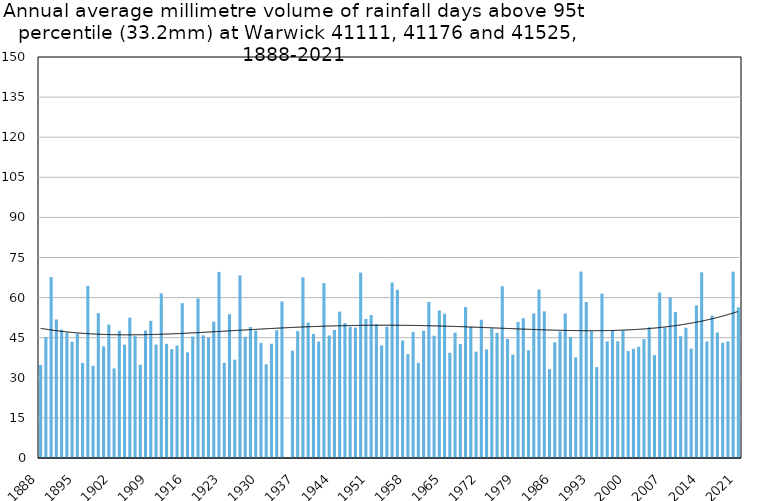
| Category | Annual average mm in days above 95th percentile |
|---|---|
| 1888 | 34.8 |
| 1889 | 45.267 |
| 1890 | 67.683 |
| 1891 | 51.82 |
| 1892 | 48 |
| 1893 | 46.878 |
| 1894 | 43.5 |
| 1895 | 46.5 |
| 1896 | 35.567 |
| 1897 | 64.4 |
| 1898 | 34.5 |
| 1899 | 54.183 |
| 1900 | 41.75 |
| 1901 | 49.9 |
| 1902 | 33.5 |
| 1903 | 47.583 |
| 1904 | 42.4 |
| 1905 | 52.5 |
| 1906 | 45.58 |
| 1907 | 34.867 |
| 1908 | 47.667 |
| 1909 | 51.3 |
| 1910 | 42.433 |
| 1911 | 61.6 |
| 1912 | 42.725 |
| 1913 | 40.7 |
| 1914 | 42.05 |
| 1915 | 57.9 |
| 1916 | 39.533 |
| 1917 | 45.45 |
| 1918 | 59.7 |
| 1919 | 45.867 |
| 1920 | 45.08 |
| 1921 | 51.01 |
| 1922 | 69.6 |
| 1923 | 35.6 |
| 1924 | 53.74 |
| 1925 | 36.767 |
| 1926 | 68.3 |
| 1927 | 45.35 |
| 1928 | 49 |
| 1929 | 47.7 |
| 1930 | 43.075 |
| 1931 | 35.033 |
| 1932 | 42.733 |
| 1933 | 47.775 |
| 1934 | 58.55 |
| 1935 | 0 |
| 1936 | 40.15 |
| 1937 | 47.45 |
| 1938 | 67.567 |
| 1939 | 50.64 |
| 1940 | 46.4 |
| 1941 | 43.533 |
| 1942 | 65.417 |
| 1943 | 45.85 |
| 1944 | 47.9 |
| 1945 | 54.767 |
| 1946 | 50.45 |
| 1947 | 49.114 |
| 1948 | 48.775 |
| 1949 | 69.35 |
| 1950 | 52.017 |
| 1951 | 53.475 |
| 1952 | 50.056 |
| 1953 | 42.1 |
| 1954 | 49.1 |
| 1955 | 65.65 |
| 1956 | 62.94 |
| 1957 | 43.95 |
| 1958 | 38.85 |
| 1959 | 47.186 |
| 1960 | 35.6 |
| 1961 | 47.58 |
| 1962 | 58.4 |
| 1963 | 45.74 |
| 1964 | 55.175 |
| 1965 | 53.957 |
| 1966 | 39.36 |
| 1967 | 46.88 |
| 1968 | 42.6 |
| 1969 | 56.467 |
| 1970 | 49 |
| 1971 | 39.78 |
| 1972 | 51.714 |
| 1973 | 40.64 |
| 1974 | 48.467 |
| 1975 | 46.817 |
| 1976 | 64.275 |
| 1977 | 44.533 |
| 1978 | 38.7 |
| 1979 | 50.9 |
| 1980 | 52.3 |
| 1981 | 40.3 |
| 1982 | 54.05 |
| 1983 | 63.029 |
| 1984 | 54.867 |
| 1985 | 33.2 |
| 1986 | 43.3 |
| 1987 | 47.35 |
| 1988 | 54.075 |
| 1989 | 45.2 |
| 1990 | 37.65 |
| 1991 | 69.733 |
| 1992 | 58.36 |
| 1993 | 47.4 |
| 1994 | 34 |
| 1995 | 61.5 |
| 1996 | 43.625 |
| 1997 | 47.667 |
| 1998 | 43.667 |
| 1999 | 47.625 |
| 2000 | 40 |
| 2001 | 40.85 |
| 2002 | 41.6 |
| 2003 | 44.5 |
| 2004 | 48.92 |
| 2005 | 38.467 |
| 2006 | 61.9 |
| 2007 | 48.75 |
| 2008 | 60.04 |
| 2009 | 54.6 |
| 2010 | 45.567 |
| 2011 | 48.733 |
| 2012 | 40.9 |
| 2013 | 57.1 |
| 2014 | 69.467 |
| 2015 | 43.567 |
| 2016 | 53.25 |
| 2017 | 46.967 |
| 2018 | 43.1 |
| 2019 | 43.6 |
| 2020 | 69.7 |
| 2021 | 56.333 |